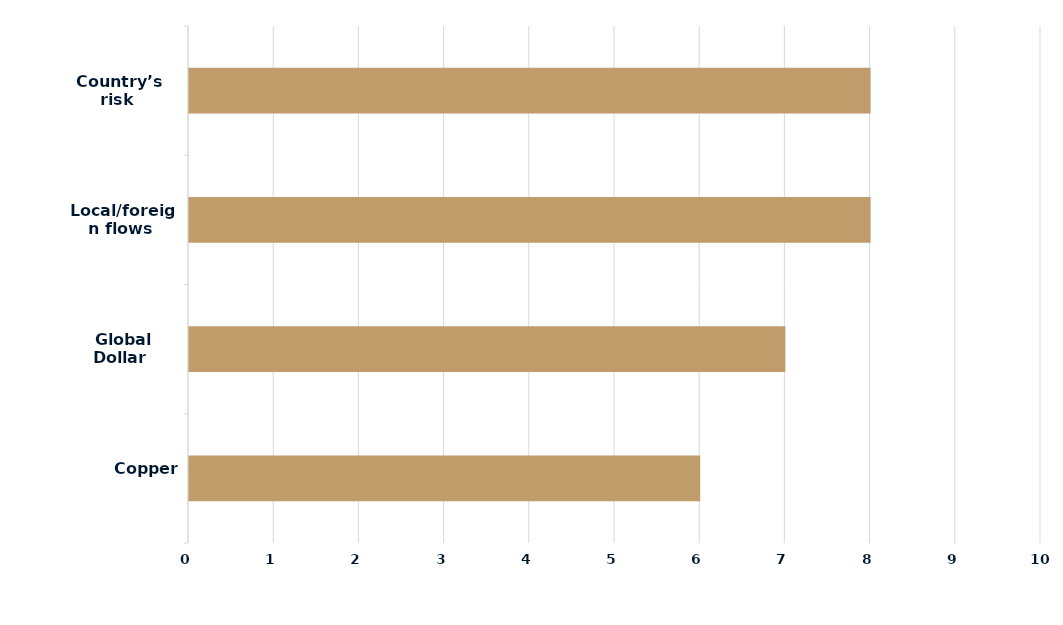
| Category | Series 0 |
|---|---|
|  Copper | 6 |
|  Global Dollar | 7 |
|  Local/foreign flows | 8 |
|  Country’s risk | 8 |